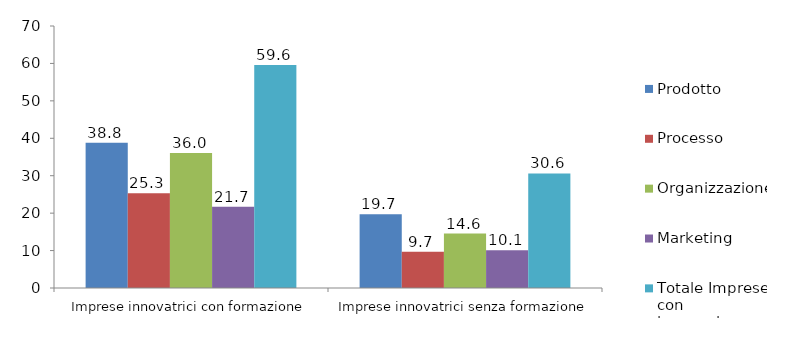
| Category | Prodotto | Processo | Organizzazione | Marketing | Totale Imprese con innovazione |
|---|---|---|---|---|---|
| Imprese innovatrici con formazione | 38.801 | 25.3 | 36.05 | 21.731 | 59.6 |
| Imprese innovatrici senza formazione | 19.7 | 9.652 | 14.553 | 10.093 | 30.6 |